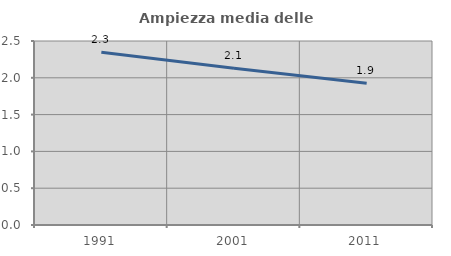
| Category | Ampiezza media delle famiglie |
|---|---|
| 1991.0 | 2.348 |
| 2001.0 | 2.13 |
| 2011.0 | 1.925 |